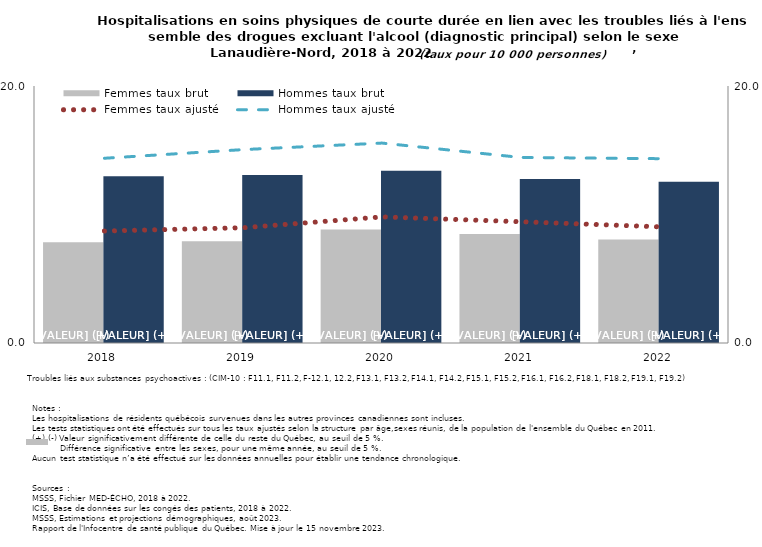
| Category | Femmes taux brut | Hommes taux brut |
|---|---|---|
| 2018.0 | 7.833 | 12.98 |
| 2019.0 | 7.915 | 13.084 |
| 2020.0 | 8.833 | 13.414 |
| 2021.0 | 8.484 | 12.76 |
| 2022.0 | 8.045 | 12.55 |